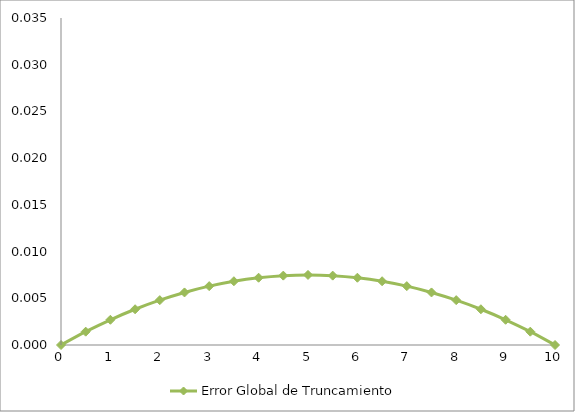
| Category | Error Global de Truncamiento |
|---|---|
| 0.0 | 0 |
| 0.5 | 0.001 |
| 1.0 | 0.003 |
| 1.5 | 0.004 |
| 2.0 | 0.005 |
| 2.5 | 0.006 |
| 3.0 | 0.006 |
| 3.5 | 0.007 |
| 4.0 | 0.007 |
| 4.5 | 0.007 |
| 5.0 | 0.008 |
| 5.5 | 0.007 |
| 6.0 | 0.007 |
| 6.5 | 0.007 |
| 7.0 | 0.006 |
| 7.5 | 0.006 |
| 8.0 | 0.005 |
| 8.5 | 0.004 |
| 9.0 | 0.003 |
| 9.5 | 0.001 |
| 10.0 | 0 |